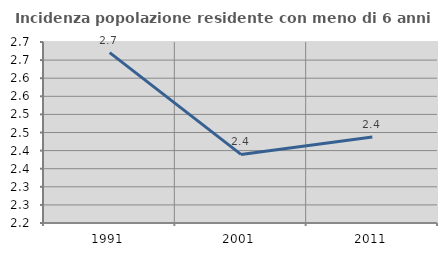
| Category | Incidenza popolazione residente con meno di 6 anni |
|---|---|
| 1991.0 | 2.671 |
| 2001.0 | 2.389 |
| 2011.0 | 2.438 |